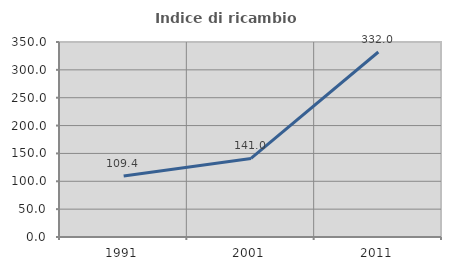
| Category | Indice di ricambio occupazionale  |
|---|---|
| 1991.0 | 109.412 |
| 2001.0 | 141.007 |
| 2011.0 | 332.043 |